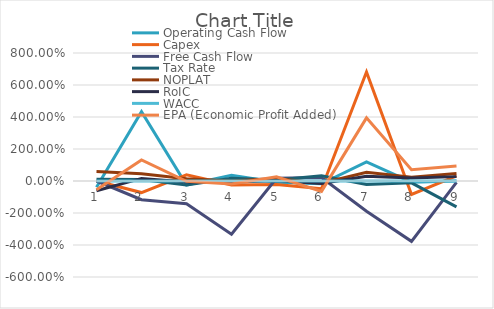
| Category | Operating Cash Flow | Capex | Free Cash Flow | Tax Rate | NOPLAT | RoIC | WACC | EPA (Economic Profit Added) |
|---|---|---|---|---|---|---|---|---|
| 0 | -0.391 | 0 | 0 | 0.107 | 0.587 | -0.606 | 0 | -0.554 |
| 1 | 4.329 | -0.724 | -1.166 | 0.093 | 0.459 | 0.162 | 0 | 1.317 |
| 2 | -0.253 | 0.39 | -1.421 | -0.244 | 0.137 | -0.058 | 0 | -0.023 |
| 3 | 0.361 | -0.255 | -3.326 | 0.168 | -0.003 | -0.063 | 0 | -0.194 |
| 4 | -0.08 | -0.212 | 0.173 | 0.067 | 0.164 | 0.023 | 0 | 0.259 |
| 5 | -0.175 | -0.481 | 0.219 | 0.321 | -0.134 | -0.15 | 0 | -0.648 |
| 6 | 1.195 | 6.819 | -1.889 | -0.22 | 0.549 | 0.289 | 0 | 3.947 |
| 7 | -0.074 | -0.841 | -3.773 | -0.117 | 0.242 | 0.185 | 0 | 0.703 |
| 8 | 0.003 | 0.318 | -0.084 | -1.619 | 0.472 | 0.273 | 0 | 0.933 |